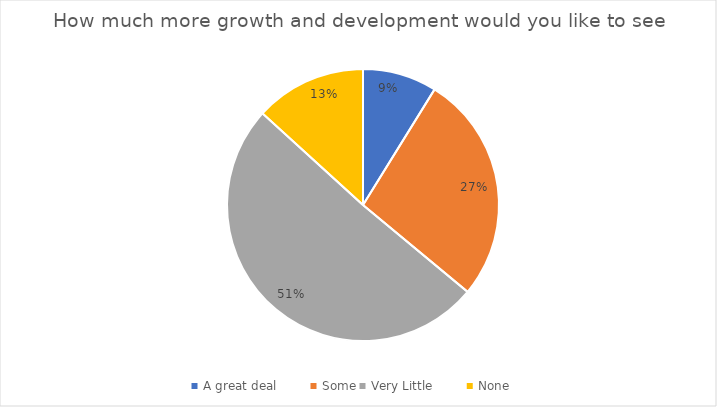
| Category | How much more growth and development would you like to see  |
|---|---|
| A great deal         | 12 |
| Some | 37 |
| Very Little         | 69 |
| None  | 18 |